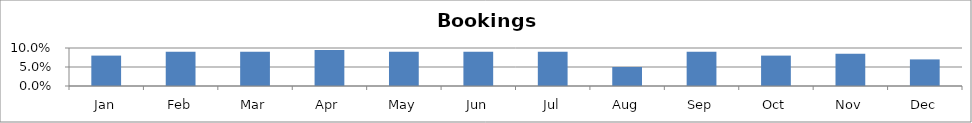
| Category | Series 0 |
|---|---|
| Jan | 0.08 |
| Feb | 0.09 |
| Mar | 0.09 |
| Apr | 0.095 |
| May | 0.09 |
| Jun | 0.09 |
| Jul | 0.09 |
| Aug | 0.05 |
| Sep | 0.09 |
| Oct | 0.08 |
| Nov | 0.085 |
| Dec | 0.07 |